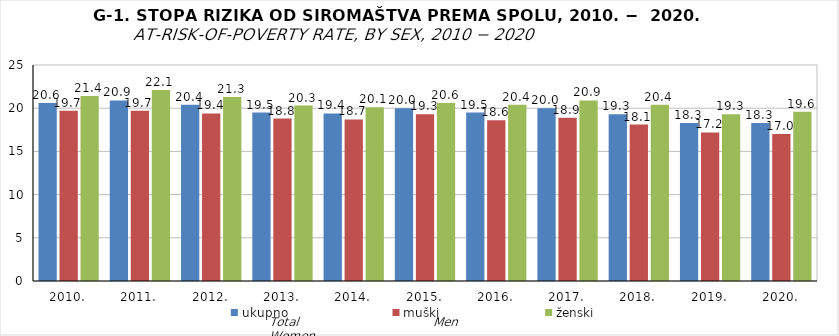
| Category | ukupno | muški | ženski |
|---|---|---|---|
| 2010. | 20.6 | 19.7 | 21.4 |
| 2011. | 20.9 | 19.7 | 22.1 |
| 2012. | 20.4 | 19.4 | 21.3 |
| 2013. | 19.5 | 18.8 | 20.3 |
| 2014. | 19.4 | 18.7 | 20.1 |
| 2015. | 20 | 19.3 | 20.6 |
| 2016. | 19.5 | 18.6 | 20.4 |
| 2017. | 20 | 18.9 | 20.9 |
| 2018. | 19.3 | 18.1 | 20.4 |
| 2019. | 18.3 | 17.2 | 19.3 |
| 2020. | 18.3 | 17 | 19.6 |